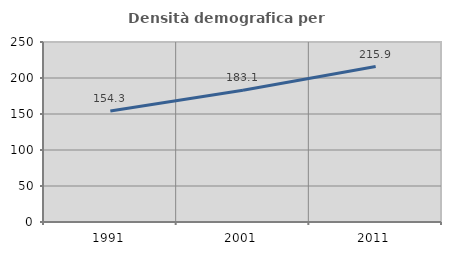
| Category | Densità demografica |
|---|---|
| 1991.0 | 154.287 |
| 2001.0 | 183.1 |
| 2011.0 | 215.943 |